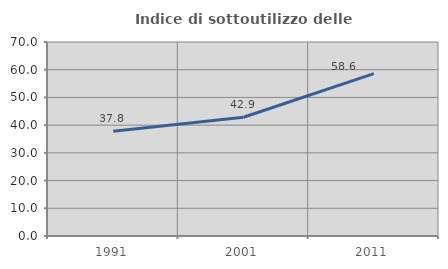
| Category | Indice di sottoutilizzo delle abitazioni  |
|---|---|
| 1991.0 | 37.778 |
| 2001.0 | 42.857 |
| 2011.0 | 58.571 |